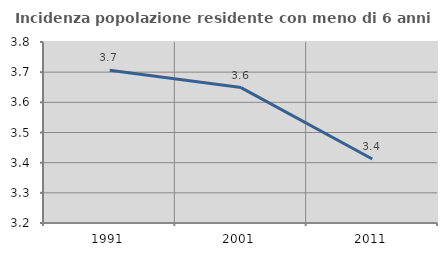
| Category | Incidenza popolazione residente con meno di 6 anni |
|---|---|
| 1991.0 | 3.706 |
| 2001.0 | 3.649 |
| 2011.0 | 3.412 |